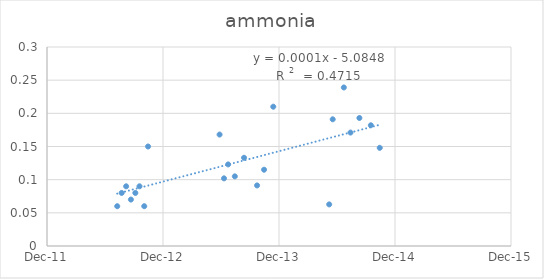
| Category | Series 0 |
|---|---|
| 41101.0 | 0.06 |
| 41115.0 | 0.08 |
| 41129.0 | 0.09 |
| 41144.0 | 0.07 |
| 41158.0 | 0.08 |
| 41171.0 | 0.09 |
| 41186.0 | 0.06 |
| 41198.0 | 0.15 |
| 41423.0 | 0.168 |
| 41437.0 | 0.102 |
| 41450.0 | 0.123 |
| 41471.0 | 0.105 |
| 41500.0 | 0.133 |
| 41541.0 | 0.091 |
| 41563.0 | 0.115 |
| 41592.0 | 0.21 |
| 41768.0 | 0.063 |
| 41779.0 | 0.191 |
| 41814.0 | 0.239 |
| 41835.0 | 0.171 |
| 41863.0 | 0.193 |
| 41899.0 | 0.182 |
| 41927.0 | 0.148 |